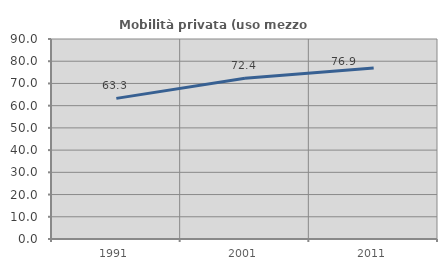
| Category | Mobilità privata (uso mezzo privato) |
|---|---|
| 1991.0 | 63.286 |
| 2001.0 | 72.352 |
| 2011.0 | 76.942 |